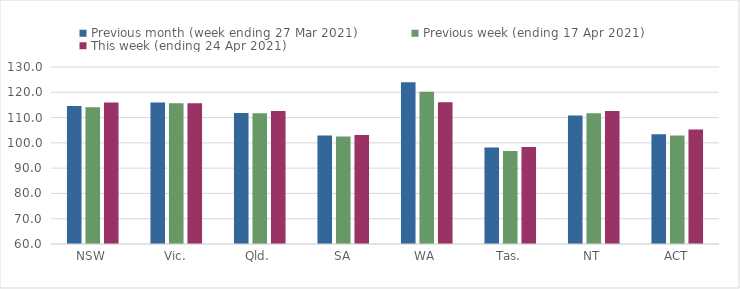
| Category | Previous month (week ending 27 Mar 2021) | Previous week (ending 17 Apr 2021) | This week (ending 24 Apr 2021) |
|---|---|---|---|
| NSW | 114.6 | 114.09 | 115.96 |
| Vic. | 115.92 | 115.69 | 115.71 |
| Qld. | 111.82 | 111.68 | 112.61 |
| SA | 102.92 | 102.5 | 103.11 |
| WA | 123.98 | 120.24 | 116.02 |
| Tas. | 98.21 | 96.8 | 98.32 |
| NT | 110.81 | 111.66 | 112.58 |
| ACT | 103.42 | 102.89 | 105.27 |